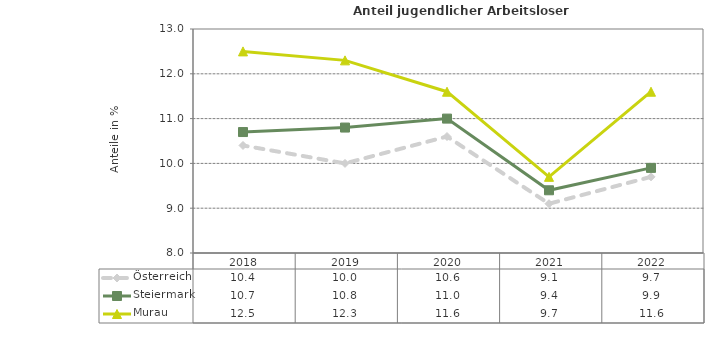
| Category | Österreich | Steiermark | Murau |
|---|---|---|---|
| 2022.0 | 9.7 | 9.9 | 11.6 |
| 2021.0 | 9.1 | 9.4 | 9.7 |
| 2020.0 | 10.6 | 11 | 11.6 |
| 2019.0 | 10 | 10.8 | 12.3 |
| 2018.0 | 10.4 | 10.7 | 12.5 |